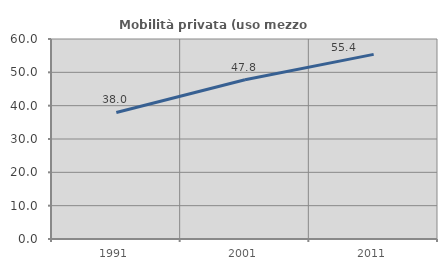
| Category | Mobilità privata (uso mezzo privato) |
|---|---|
| 1991.0 | 37.96 |
| 2001.0 | 47.79 |
| 2011.0 | 55.39 |